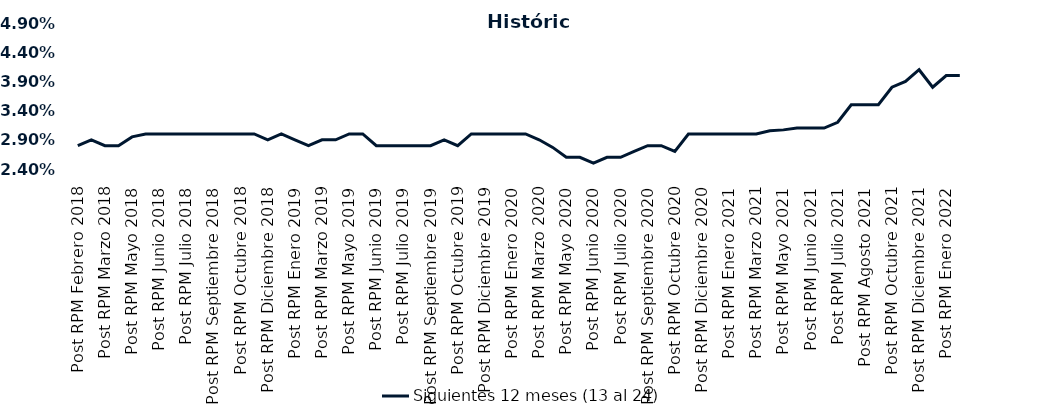
| Category | Siguientes 12 meses (13 al 24)  |
|---|---|
| Post RPM Febrero 2018 | 0.028 |
| Pre RPM Marzo 2018 | 0.029 |
| Post RPM Marzo 2018 | 0.028 |
| Pre RPM Mayo 2018 | 0.028 |
| Post RPM Mayo 2018 | 0.03 |
| Pre RPM Junio 2018 | 0.03 |
| Post RPM Junio 2018 | 0.03 |
| Pre RPM Julio 2018 | 0.03 |
| Post RPM Julio 2018 | 0.03 |
| Pre RPM Septiembre 2018 | 0.03 |
| Post RPM Septiembre 2018 | 0.03 |
| Pre RPM Octubre 2018 | 0.03 |
| Post RPM Octubre 2018 | 0.03 |
| Pre RPM Diciembre 2018 | 0.03 |
| Post RPM Diciembre 2018 | 0.029 |
| Pre RPM Enero 2019 | 0.03 |
| Post RPM Enero 2019 | 0.029 |
| Pre RPM Marzo 2019 | 0.028 |
| Post RPM Marzo 2019 | 0.029 |
| Pre RPM Mayo 2019 | 0.029 |
| Post RPM Mayo 2019 | 0.03 |
| Pre RPM Junio 2019 | 0.03 |
| Post RPM Junio 2019 | 0.028 |
| Pre RPM Julio 2019 | 0.028 |
| Post RPM Julio 2019 | 0.028 |
| Pre RPM Septiembre 2019 | 0.028 |
| Post RPM Septiembre 2019 | 0.028 |
| Pre RPM Octubre 2019 | 0.029 |
| Post RPM Octubre 2019 | 0.028 |
| Pre RPM Diciembre 2019 | 0.03 |
| Post RPM Diciembre 2019 | 0.03 |
| Pre RPM Enero 2020 | 0.03 |
| Post RPM Enero 2020 | 0.03 |
| Pre RPM Marzo 2020 | 0.03 |
| Post RPM Marzo 2020 | 0.029 |
| Pre RPM Mayo 2020 | 0.028 |
| Post RPM Mayo 2020 | 0.026 |
| Pre RPM Junio 2020 | 0.026 |
| Post RPM Junio 2020 | 0.025 |
| Pre RPM Julio 2020 | 0.026 |
| Post RPM Julio 2020 | 0.026 |
| Pre RPM Septiembre 2020 | 0.027 |
| Post RPM Septiembre 2020 | 0.028 |
| Pre RPM Octubre 2020 | 0.028 |
| Post RPM Octubre 2020 | 0.027 |
| Pre RPM Diciembre 2020 | 0.03 |
| Post RPM Diciembre 2020 | 0.03 |
| Pre RPM Enero 2021 | 0.03 |
| Post RPM Enero 2021 | 0.03 |
| Pre RPM Marzo 2021 | 0.03 |
| Post RPM Marzo 2021 | 0.03 |
| Pre RPM Mayo 2021 | 0.031 |
| Post RPM Mayo 2021 | 0.031 |
| Pre RPM Junio 2021 | 0.031 |
| Post RPM Junio 2021 | 0.031 |
| Pre RPM Julio 2021 | 0.031 |
| Post RPM Julio 2021 | 0.032 |
| Pre RPM Agosto 2021 | 0.035 |
| Post RPM Agosto 2021 | 0.035 |
| Pre RPM Octubre 2021 | 0.035 |
| Post RPM Octubre 2021 | 0.038 |
| Pre RPM Diciembre 2021 | 0.039 |
| Post RPM Diciembre 2021 | 0.041 |
| Pre RPM Enero 2022 | 0.038 |
| Post RPM Enero 2022 | 0.04 |
| Pre RPM Marzo 2022 | 0.04 |